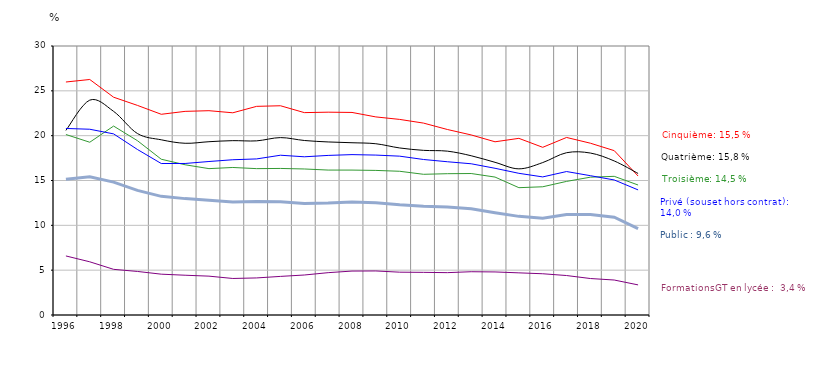
| Category | 5ème | 4ème | 3ème | Formations GT en lycée | Privé (sous et hors contrat) | Public |
|---|---|---|---|---|---|---|
| 1996.0 | 25.985 | 20.584 | 20.129 | 6.585 | 20.804 | 15.141 |
| 1997.0 | 26.264 | 23.964 | 19.267 | 5.933 | 20.717 | 15.419 |
| 1998.0 | 24.289 | 22.71 | 21.071 | 5.092 | 20.199 | 14.816 |
| 1999.0 | 23.376 | 20.237 | 19.439 | 4.857 | 18.458 | 13.896 |
| 2000.0 | 22.384 | 19.538 | 17.371 | 4.553 | 16.892 | 13.231 |
| 2001.0 | 22.71 | 19.151 | 16.753 | 4.436 | 16.899 | 12.979 |
| 2002.0 | 22.785 | 19.326 | 16.323 | 4.333 | 17.119 | 12.795 |
| 2003.0 | 22.552 | 19.444 | 16.453 | 4.074 | 17.316 | 12.589 |
| 2004.0 | 23.269 | 19.422 | 16.323 | 4.134 | 17.408 | 12.662 |
| 2005.0 | 23.335 | 19.785 | 16.345 | 4.306 | 17.818 | 12.639 |
| 2006.0 | 22.57 | 19.462 | 16.285 | 4.46 | 17.644 | 12.424 |
| 2007.0 | 22.619 | 19.3 | 16.164 | 4.722 | 17.797 | 12.489 |
| 2008.0 | 22.589 | 19.211 | 16.162 | 4.899 | 17.886 | 12.615 |
| 2009.0 | 22.092 | 19.099 | 16.125 | 4.911 | 17.835 | 12.524 |
| 2010.0 | 21.813 | 18.629 | 16.028 | 4.775 | 17.714 | 12.293 |
| 2011.0 | 21.402 | 18.363 | 15.692 | 4.757 | 17.344 | 12.123 |
| 2012.0 | 20.688 | 18.273 | 15.759 | 4.724 | 17.092 | 12.033 |
| 2013.0 | 20.081 | 17.76 | 15.778 | 4.826 | 16.865 | 11.846 |
| 2014.0 | 19.318 | 17.027 | 15.382 | 4.802 | 16.361 | 11.4 |
| 2015.0 | 19.7 | 16.3 | 14.2 | 4.7 | 15.8 | 11 |
| 2016.0 | 18.7 | 17 | 14.3 | 4.6 | 15.4 | 10.8 |
| 2017.0 | 19.8 | 18.1 | 14.9 | 4.4 | 16 | 11.2 |
| 2018.0 | 19.159 | 18.062 | 15.37 | 4.068 | 15.537 | 11.209 |
| 2019.0 | 18.329 | 17.179 | 15.464 | 3.9 | 15.06 | 10.9 |
| 2020.0 | 15.5 | 15.786 | 14.497 | 3.356 | 13.952 | 9.626 |